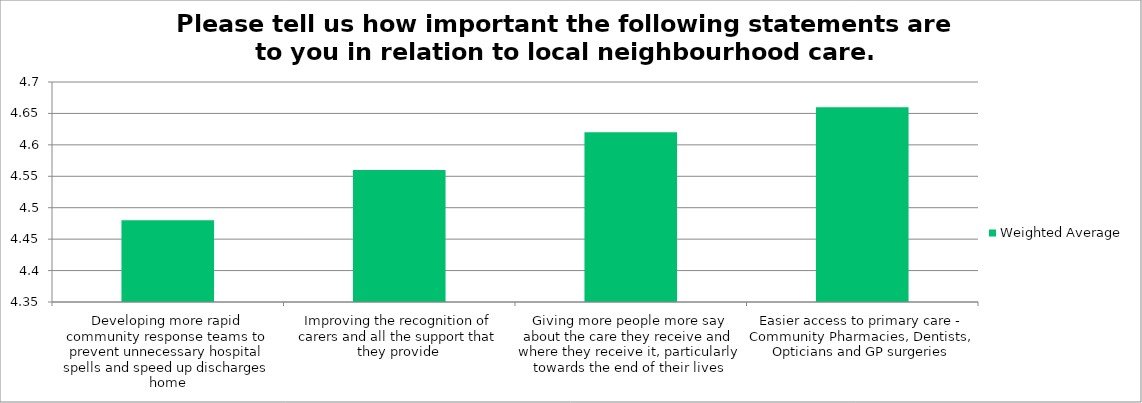
| Category | Weighted Average |
|---|---|
| Developing more rapid community response teams to prevent unnecessary hospital spells and speed up discharges home | 4.48 |
| Improving the recognition of carers and all the support that they provide | 4.56 |
| Giving more people more say about the care they receive and where they receive it, particularly towards the end of their lives | 4.62 |
| Easier access to primary care - Community Pharmacies, Dentists, Opticians and GP surgeries | 4.66 |